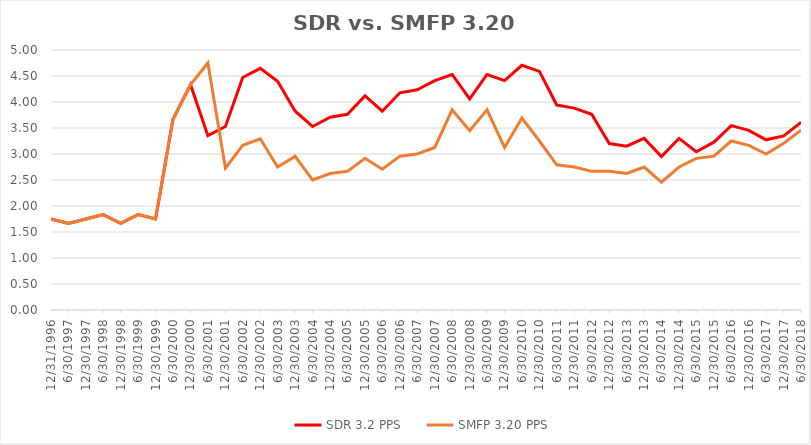
| Category | SDR 3.2 PPS | SMFP 3.20 PPS |
|---|---|---|
| 12/31/96 | 1.75 | 1.75 |
| 6/30/97 | 1.667 | 1.667 |
| 12/31/97 | 1.75 | 1.75 |
| 6/30/98 | 1.833 | 1.833 |
| 12/31/98 | 1.667 | 1.667 |
| 6/30/99 | 1.833 | 1.833 |
| 12/31/99 | 1.75 | 1.75 |
| 6/30/00 | 3.667 | 3.667 |
| 12/31/00 | 4.333 | 4.333 |
| 6/30/01 | 3.353 | 4.75 |
| 12/31/01 | 3.529 | 2.727 |
| 6/30/02 | 4.471 | 3.167 |
| 12/31/02 | 4.647 | 3.292 |
| 6/30/03 | 4.4 | 2.75 |
| 12/31/03 | 3.824 | 2.955 |
| 6/30/04 | 3.529 | 2.5 |
| 12/31/04 | 3.706 | 2.625 |
| 6/30/05 | 3.765 | 2.667 |
| 12/31/05 | 4.118 | 2.917 |
| 6/30/06 | 3.824 | 2.708 |
| 12/31/06 | 4.176 | 2.958 |
| 6/30/07 | 4.235 | 3 |
| 12/31/07 | 4.412 | 3.125 |
| 6/30/08 | 4.529 | 3.85 |
| 12/31/08 | 4.059 | 3.45 |
| 6/30/09 | 4.529 | 3.85 |
| 12/31/09 | 4.412 | 3.125 |
| 6/30/10 | 4.706 | 3.693 |
| 12/31/10 | 4.588 | 3.25 |
| 6/30/11 | 3.941 | 2.792 |
| 12/31/11 | 3.882 | 2.75 |
| 6/30/12 | 3.765 | 2.667 |
| 12/31/12 | 3.2 | 2.667 |
| 6/30/13 | 3.15 | 2.625 |
| 12/31/13 | 3.3 | 2.75 |
| 6/30/14 | 2.95 | 2.458 |
| 12/31/14 | 3.3 | 2.75 |
| 6/30/15 | 3.043 | 2.917 |
| 12/31/15 | 3.227 | 2.958 |
| 6/30/16 | 3.545 | 3.25 |
| 12/31/16 | 3.455 | 3.167 |
| 6/30/17 | 3.273 | 3 |
| 12/31/17 | 3.348 | 3.208 |
| 6/30/18 | 3.609 | 3.458 |